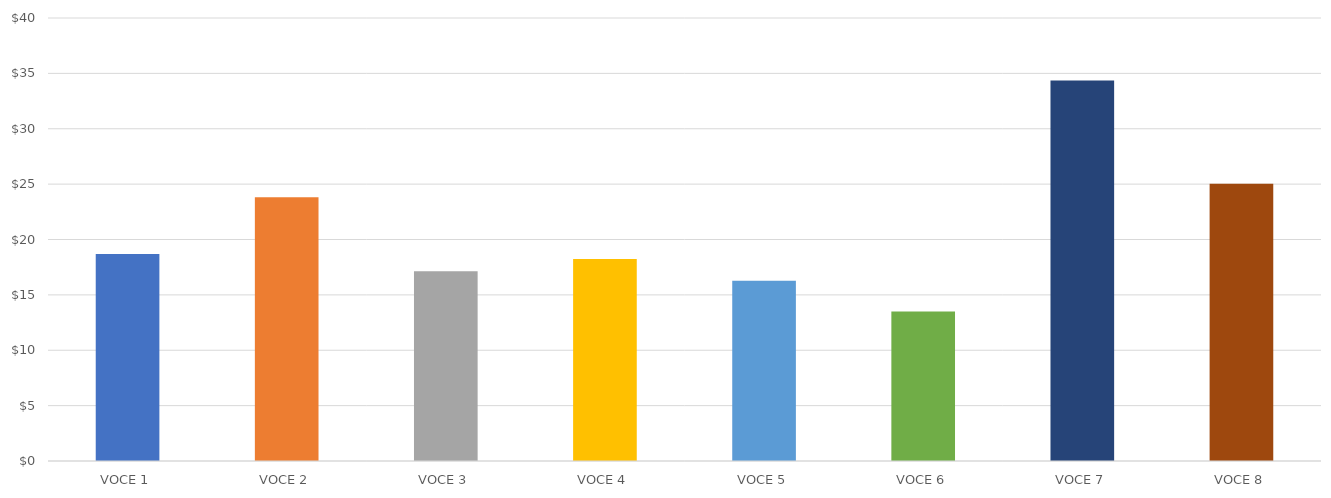
| Category | PROFITTO PER VOCE |
|---|---|
| VOCE 1 | 18.685 |
| VOCE 2 | 23.815 |
| VOCE 3 | 17.125 |
| VOCE 4 | 18.25 |
| VOCE 5 | 16.275 |
| VOCE 6 | 13.5 |
| VOCE 7 | 34.35 |
| VOCE 8 | 25.04 |